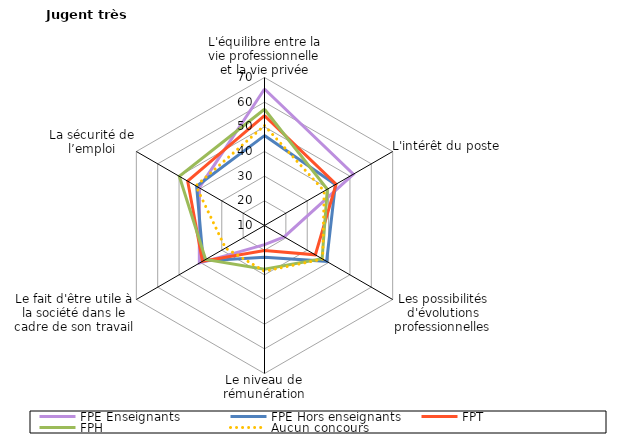
| Category | FPE Enseignants | FPE Hors enseignants | FPT  | FPH | Aucun concours |
|---|---|---|---|---|---|
| L'équilibre entre la vie professionnelle et la vie privée | 65.337 | 46.447 | 54.51 | 57.13 | 50.5 |
| L'intérêt du poste | 51.623 | 43.18 | 43.5 | 39.4 | 37.93 |
| Les possibilités d'évolutions professionnelles | 19.203 | 39.074 | 33.8 | 36.97 | 37.24 |
| Le niveau de rémunération | 17.765 | 22.873 | 20.17 | 27.69 | 28.53 |
| Le fait d'être utile à la société dans le cadre de son travail | 40.501 | 38.691 | 39.03 | 37.56 | 28.27 |
| La sécurité de l’emploi | 40.554 | 41.772 | 45.96 | 49.88 | 42.12 |